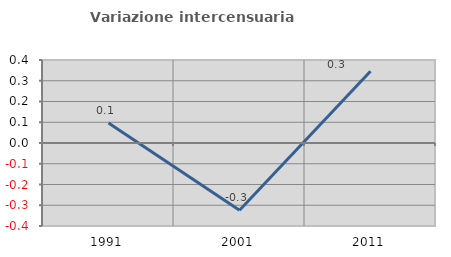
| Category | Variazione intercensuaria annua |
|---|---|
| 1991.0 | 0.096 |
| 2001.0 | -0.324 |
| 2011.0 | 0.346 |